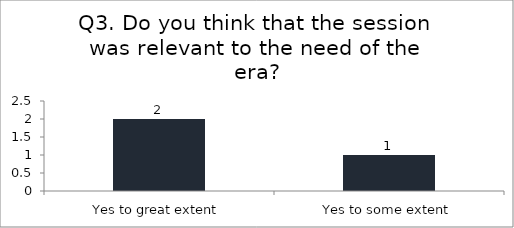
| Category | Q3. Do you think that the session was relevant to the need of the era? |
|---|---|
| Yes to great extent | 2 |
| Yes to some extent | 1 |